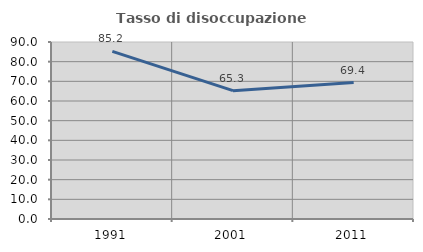
| Category | Tasso di disoccupazione giovanile  |
|---|---|
| 1991.0 | 85.246 |
| 2001.0 | 65.254 |
| 2011.0 | 69.388 |